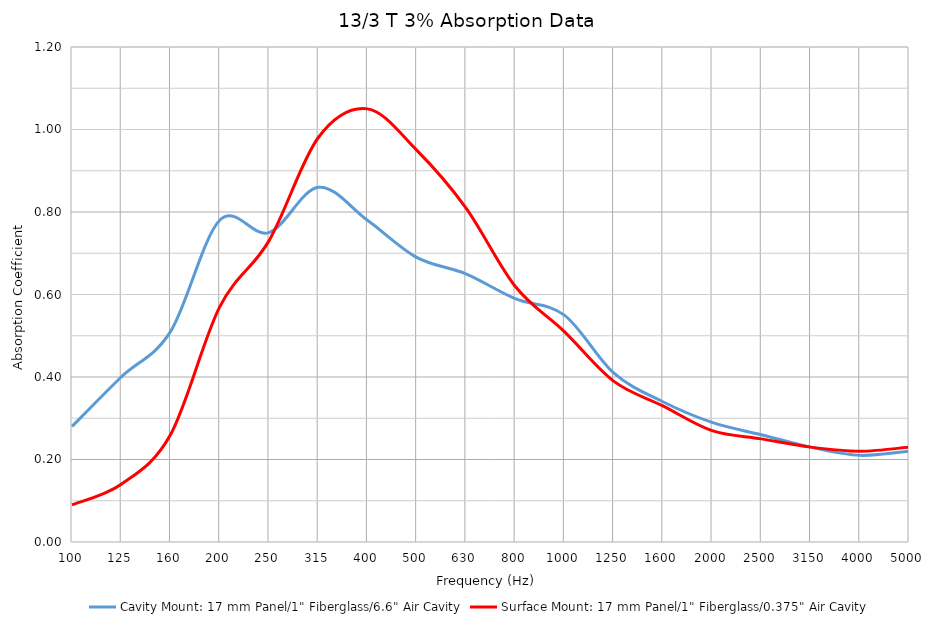
| Category | Cavity Mount: 17 mm Panel/1" Fiberglass/6.6" Air Cavity | Surface Mount: 17 mm Panel/1" Fiberglass/0.375" Air Cavity |
|---|---|---|
| 100.0 | 0.28 | 0.09 |
| 125.0 | 0.4 | 0.14 |
| 160.0 | 0.51 | 0.26 |
| 200.0 | 0.78 | 0.57 |
| 250.0 | 0.75 | 0.73 |
| 315.0 | 0.86 | 0.98 |
| 400.0 | 0.78 | 1.05 |
| 500.0 | 0.69 | 0.95 |
| 630.0 | 0.65 | 0.81 |
| 800.0 | 0.59 | 0.62 |
| 1000.0 | 0.55 | 0.51 |
| 1250.0 | 0.41 | 0.39 |
| 1600.0 | 0.34 | 0.33 |
| 2000.0 | 0.29 | 0.27 |
| 2500.0 | 0.26 | 0.25 |
| 3150.0 | 0.23 | 0.23 |
| 4000.0 | 0.21 | 0.22 |
| 5000.0 | 0.22 | 0.23 |